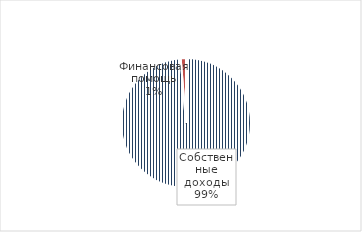
| Category | Series 0 |
|---|---|
| Собственные доходы | 41642 |
| Финансовая помощь | 555 |